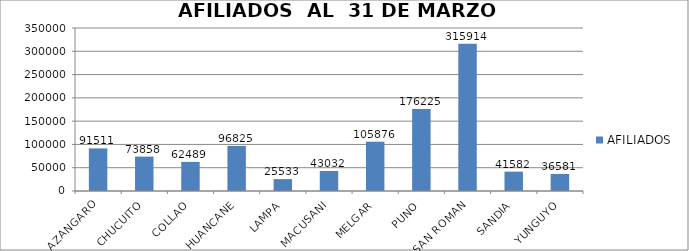
| Category | AFILIADOS |
|---|---|
| AZANGARO | 91511 |
| CHUCUITO | 73858 |
| COLLAO | 62489 |
| HUANCANE | 96825 |
| LAMPA | 25533 |
| MACUSANI | 43032 |
| MELGAR | 105876 |
| PUNO | 176225 |
| SAN ROMAN | 315914 |
| SANDIA | 41582 |
| YUNGUYO | 36581 |